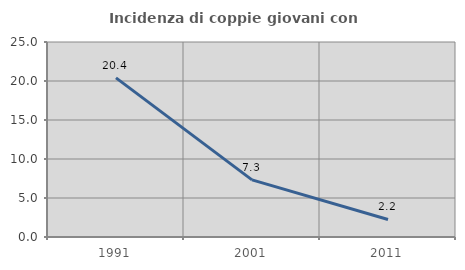
| Category | Incidenza di coppie giovani con figli |
|---|---|
| 1991.0 | 20.398 |
| 2001.0 | 7.325 |
| 2011.0 | 2.247 |